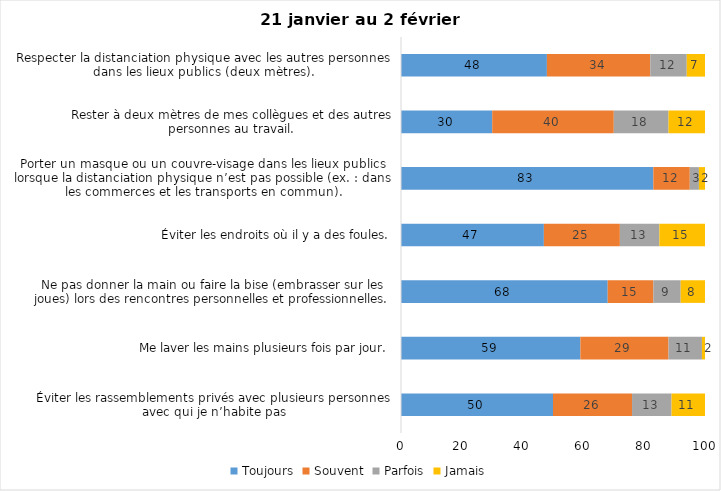
| Category | Toujours | Souvent | Parfois | Jamais |
|---|---|---|---|---|
| Éviter les rassemblements privés avec plusieurs personnes avec qui je n’habite pas | 50 | 26 | 13 | 11 |
| Me laver les mains plusieurs fois par jour. | 59 | 29 | 11 | 2 |
| Ne pas donner la main ou faire la bise (embrasser sur les joues) lors des rencontres personnelles et professionnelles. | 68 | 15 | 9 | 8 |
| Éviter les endroits où il y a des foules. | 47 | 25 | 13 | 15 |
| Porter un masque ou un couvre-visage dans les lieux publics lorsque la distanciation physique n’est pas possible (ex. : dans les commerces et les transports en commun). | 83 | 12 | 3 | 2 |
| Rester à deux mètres de mes collègues et des autres personnes au travail. | 30 | 40 | 18 | 12 |
| Respecter la distanciation physique avec les autres personnes dans les lieux publics (deux mètres). | 48 | 34 | 12 | 7 |